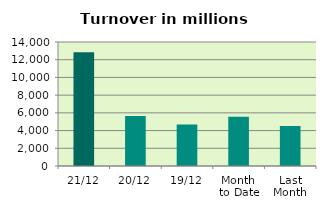
| Category | Series 0 |
|---|---|
| 21/12 | 12852.802 |
| 20/12 | 5653.436 |
| 19/12 | 4685.754 |
| Month 
to Date | 5558.14 |
| Last
Month | 4514.728 |